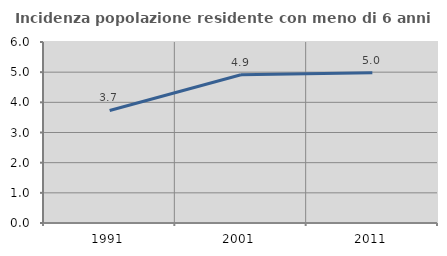
| Category | Incidenza popolazione residente con meno di 6 anni |
|---|---|
| 1991.0 | 3.73 |
| 2001.0 | 4.916 |
| 2011.0 | 4.982 |